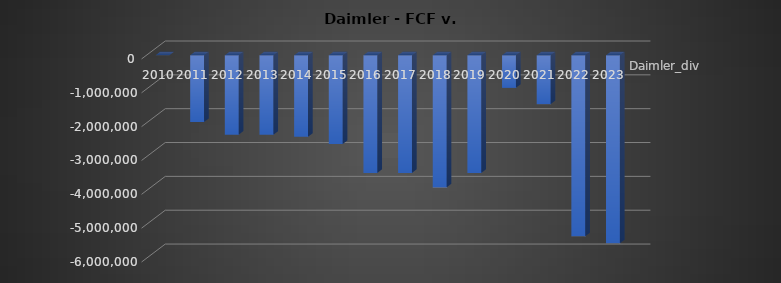
| Category | Daimler_div | Daimler_FCF |
|---|---|---|
| 2010.0 | 0 |  |
| 2011.0 | -1971000 |  |
| 2012.0 | -2346000 |  |
| 2013.0 | -2349000 |  |
| 2014.0 | -2407000 |  |
| 2015.0 | -2621000 |  |
| 2016.0 | -3477000 |  |
| 2017.0 | -3477000 |  |
| 2018.0 | -3905000 |  |
| 2019.0 | -3477000 |  |
| 2020.0 | -963000 |  |
| 2021.0 | -1444000 |  |
| 2022.0 | -5349000 |  |
| 2023.0 | -5556000 |  |